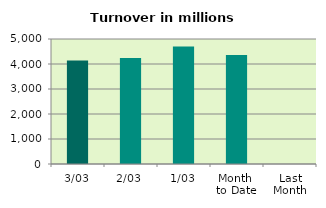
| Category | Series 0 |
|---|---|
| 3/03 | 4144.3 |
| 2/03 | 4238.993 |
| 1/03 | 4699.639 |
| Month 
to Date | 4360.977 |
| Last
Month | 0 |